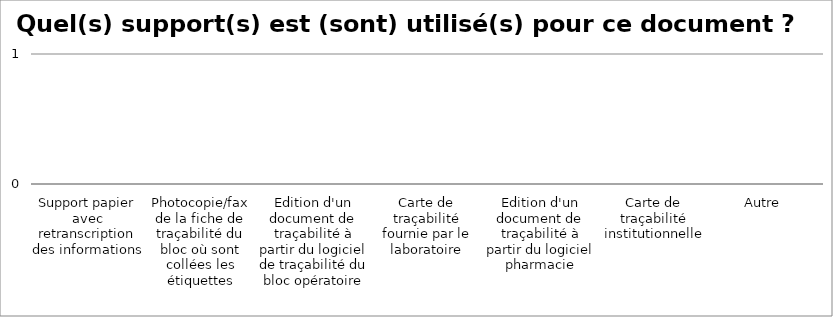
| Category | Quel(s) support(s) est (sont) utilisé(s) pour ce document ? Choix multiple |
|---|---|
| Support papier avec retranscription des informations | 0 |
| Photocopie/fax de la fiche de traçabilité du bloc où sont collées les étiquettes | 0 |
| Edition d'un document de traçabilité à partir du logiciel de traçabilité du bloc opératoire | 0 |
| Carte de traçabilité fournie par le laboratoire | 0 |
| Edition d'un document de traçabilité à partir du logiciel pharmacie | 0 |
| Carte de traçabilité institutionnelle | 0 |
| Autre  | 0 |